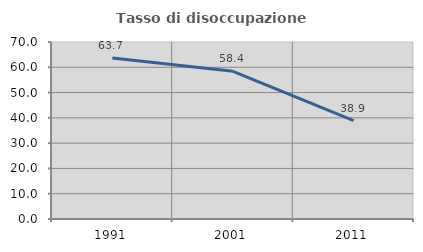
| Category | Tasso di disoccupazione giovanile  |
|---|---|
| 1991.0 | 63.669 |
| 2001.0 | 58.407 |
| 2011.0 | 38.877 |